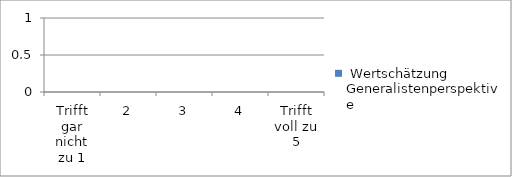
| Category |  Wertschätzung Generalistenperspektive |
|---|---|
| Trifft gar nicht zu 1 | 0 |
| 2 | 0 |
| 3 | 0 |
| 4 | 0 |
| Trifft voll zu 5 | 0 |